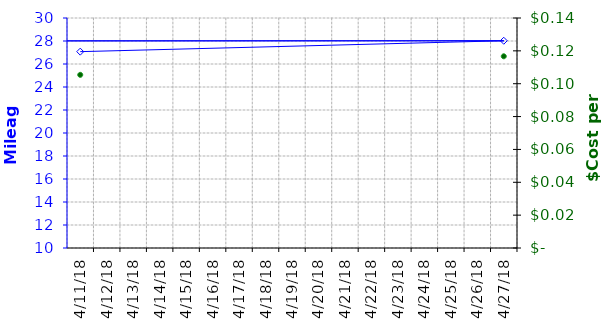
| Category | MPG |
|---|---|
| 4/11/18 | 27.075 |
| 4/27/18 | 28.021 |
| nan | 0 |
| nan | 0 |
| nan | 0 |
| nan | 0 |
| nan | 0 |
| nan | 0 |
| nan | 0 |
| nan | 0 |
| nan | 0 |
| nan | 0 |
| nan | 0 |
| nan | 0 |
| nan | 0 |
| nan | 0 |
| nan | 0 |
| nan | 0 |
| nan | 0 |
| nan | 0 |
| nan | 0 |
| nan | 0 |
| nan | 0 |
| nan | 0 |
| nan | 0 |
| nan | 0 |
| nan | 0 |
| nan | 0 |
| nan | 0 |
| nan | 0 |
| nan | 0 |
| nan | 0 |
| nan | 0 |
| nan | 0 |
| nan | 0 |
| nan | 0 |
| nan | 0 |
| nan | 0 |
| nan | 0 |
| nan | 0 |
| nan | 0 |
| nan | 0 |